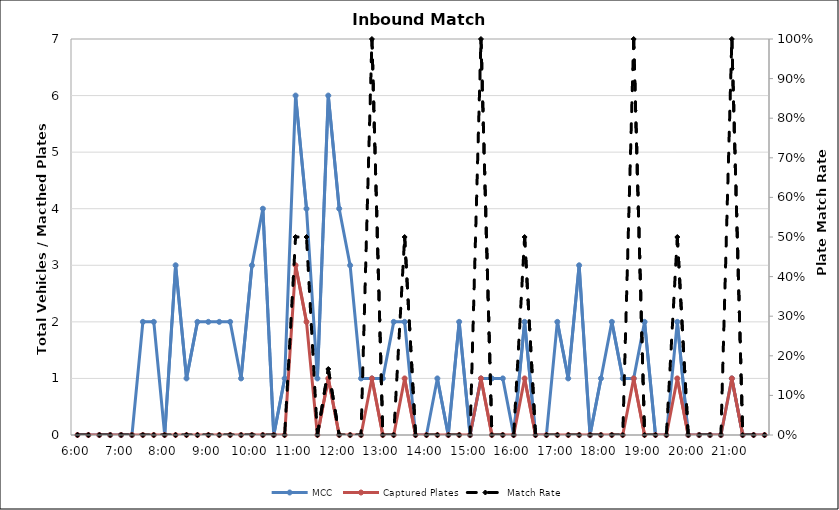
| Category | MCC | Captured Plates |
|---|---|---|
| 0.25 | 0 | 0 |
| 0.260416666666667 | 0 | 0 |
| 0.270833333333333 | 0 | 0 |
| 0.28125 | 0 | 0 |
| 0.291666666666667 | 0 | 0 |
| 0.302083333333333 | 0 | 0 |
| 0.3125 | 2 | 0 |
| 0.322916666666667 | 2 | 0 |
| 0.333333333333333 | 0 | 0 |
| 0.34375 | 3 | 0 |
| 0.354166666666667 | 1 | 0 |
| 0.364583333333333 | 2 | 0 |
| 0.375 | 2 | 0 |
| 0.385416666666667 | 2 | 0 |
| 0.395833333333333 | 2 | 0 |
| 0.40625 | 1 | 0 |
| 0.416666666666667 | 3 | 0 |
| 0.427083333333333 | 4 | 0 |
| 0.4375 | 0 | 0 |
| 0.447916666666667 | 1 | 0 |
| 0.458333333333333 | 6 | 3 |
| 0.46875 | 4 | 2 |
| 0.479166666666667 | 1 | 0 |
| 0.489583333333333 | 6 | 1 |
| 0.5 | 4 | 0 |
| 0.510416666666667 | 3 | 0 |
| 0.520833333333333 | 1 | 0 |
| 0.53125 | 1 | 1 |
| 0.541666666666667 | 1 | 0 |
| 0.552083333333333 | 2 | 0 |
| 0.5625 | 2 | 1 |
| 0.572916666666667 | 0 | 0 |
| 0.583333333333333 | 0 | 0 |
| 0.59375 | 1 | 0 |
| 0.604166666666667 | 0 | 0 |
| 0.614583333333333 | 2 | 0 |
| 0.625 | 0 | 0 |
| 0.635416666666667 | 1 | 1 |
| 0.645833333333333 | 1 | 0 |
| 0.65625 | 1 | 0 |
| 0.666666666666667 | 0 | 0 |
| 0.677083333333333 | 2 | 1 |
| 0.6875 | 0 | 0 |
| 0.697916666666667 | 0 | 0 |
| 0.708333333333333 | 2 | 0 |
| 0.71875 | 1 | 0 |
| 0.729166666666667 | 3 | 0 |
| 0.739583333333333 | 0 | 0 |
| 0.75 | 1 | 0 |
| 0.760416666666667 | 2 | 0 |
| 0.770833333333333 | 1 | 0 |
| 0.78125 | 1 | 1 |
| 0.791666666666667 | 2 | 0 |
| 0.802083333333333 | 0 | 0 |
| 0.8125 | 0 | 0 |
| 0.822916666666667 | 2 | 1 |
| 0.833333333333333 | 0 | 0 |
| 0.84375 | 0 | 0 |
| 0.854166666666667 | 0 | 0 |
| 0.864583333333333 | 0 | 0 |
| 0.875 | 1 | 1 |
| 0.885416666666667 | 0 | 0 |
| 0.895833333333333 | 0 | 0 |
| 0.90625 | 0 | 0 |